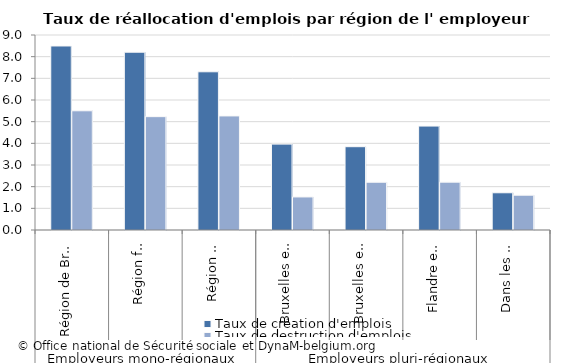
| Category | Taux de création d'emplois | Taux de destruction d'emplois |
|---|---|---|
| 0 | 8.494 | 5.502 |
| 1 | 8.206 | 5.231 |
| 2 | 7.302 | 5.265 |
| 3 | 3.964 | 1.525 |
| 4 | 3.845 | 2.204 |
| 5 | 4.797 | 2.209 |
| 6 | 1.718 | 1.606 |